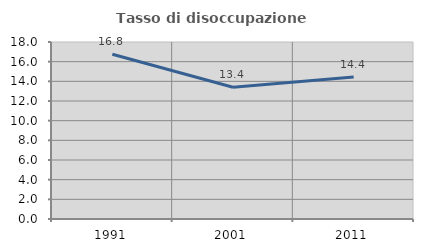
| Category | Tasso di disoccupazione giovanile  |
|---|---|
| 1991.0 | 16.76 |
| 2001.0 | 13.402 |
| 2011.0 | 14.433 |